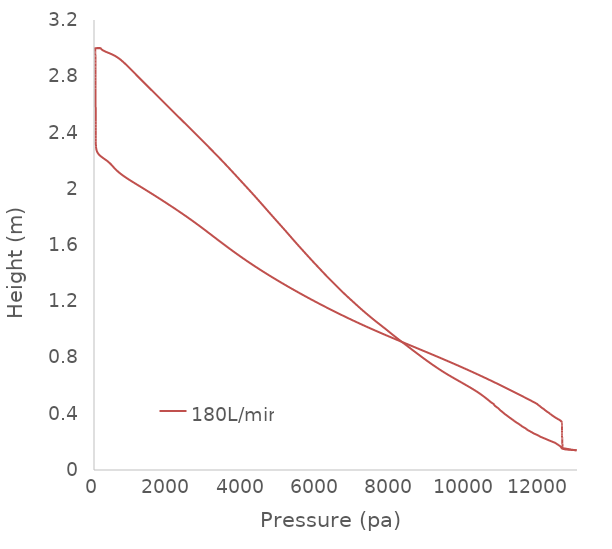
| Category | 180L/min |
|---|---|
| 12989.8 | 0.14 |
| 12873.3 | 0.144 |
| 12839.8 | 0.145 |
| 12805.4 | 0.146 |
| 12789.6 | 0.148 |
| 12781.4 | 0.148 |
| 12733.1 | 0.15 |
| 12626.4 | 0.155 |
| 12600.3 | 0.16 |
| 12592.9 | 0.161 |
| 12579.8 | 0.163 |
| 12565.2 | 0.165 |
| 12561.5 | 0.165 |
| 12538.0 | 0.171 |
| 12532.4 | 0.172 |
| 12508.9 | 0.176 |
| 12489.8 | 0.179 |
| 12482.9 | 0.181 |
| 12481.7 | 0.181 |
| 12480.0 | 0.181 |
| 12477.1 | 0.182 |
| 12473.1 | 0.182 |
| 12468.8 | 0.183 |
| 12459.2 | 0.185 |
| 12419.6 | 0.192 |
| 12405.7 | 0.194 |
| 12341.0 | 0.2 |
| 12339.1 | 0.201 |
| 12335.1 | 0.201 |
| 12332.5 | 0.201 |
| 12329.9 | 0.202 |
| 12326.6 | 0.202 |
| 12228.7 | 0.213 |
| 12225.3 | 0.213 |
| 12221.2 | 0.214 |
| 12216.1 | 0.214 |
| 12212.2 | 0.215 |
| 12127.2 | 0.224 |
| 12122.5 | 0.225 |
| 12119.1 | 0.225 |
| 12113.7 | 0.226 |
| 12104.6 | 0.227 |
| 12081.7 | 0.229 |
| 12074.8 | 0.23 |
| 12013.3 | 0.237 |
| 12000.2 | 0.239 |
| 11978.7 | 0.242 |
| 11927.0 | 0.249 |
| 11925.8 | 0.25 |
| 11921.2 | 0.25 |
| 11912.1 | 0.251 |
| 11911.8 | 0.251 |
| 11904.4 | 0.252 |
| 11903.8 | 0.252 |
| 11903.5 | 0.252 |
| 11845.5 | 0.259 |
| 11843.0 | 0.259 |
| 11804.2 | 0.265 |
| 11801.4 | 0.265 |
| 11798.2 | 0.266 |
| 11796.9 | 0.266 |
| 11750.8 | 0.273 |
| 11740.7 | 0.274 |
| 11740.6 | 0.274 |
| 11739.9 | 0.275 |
| 11735.3 | 0.275 |
| 11734.8 | 0.275 |
| 11709.9 | 0.279 |
| 11674.6 | 0.284 |
| 11669.1 | 0.285 |
| 11664.1 | 0.286 |
| 11660.1 | 0.286 |
| 11627.2 | 0.293 |
| 11614.3 | 0.296 |
| 11614.2 | 0.296 |
| 11613.7 | 0.296 |
| 11611.8 | 0.297 |
| 11606.0 | 0.298 |
| 11602.3 | 0.298 |
| 11574.0 | 0.302 |
| 11542.9 | 0.307 |
| 11537.3 | 0.308 |
| 11533.9 | 0.308 |
| 11532.3 | 0.308 |
| 11528.4 | 0.309 |
| 11518.9 | 0.311 |
| 11518.0 | 0.311 |
| 11512.5 | 0.312 |
| 11468.9 | 0.321 |
| 11463.5 | 0.322 |
| 11460.0 | 0.323 |
| 11423.0 | 0.329 |
| 11417.9 | 0.33 |
| 11410.7 | 0.331 |
| 11404.7 | 0.332 |
| 11402.2 | 0.333 |
| 11398.3 | 0.333 |
| 11397.1 | 0.333 |
| 11350.8 | 0.341 |
| 11347.8 | 0.342 |
| 11339.6 | 0.343 |
| 11331.8 | 0.345 |
| 11314.1 | 0.348 |
| 11314.0 | 0.348 |
| 11313.9 | 0.348 |
| 11313.6 | 0.348 |
| 11306.8 | 0.35 |
| 11300.0 | 0.351 |
| 11281.8 | 0.355 |
| 11280.9 | 0.355 |
| 11261.1 | 0.359 |
| 11253.6 | 0.36 |
| 11252.7 | 0.36 |
| 11249.8 | 0.361 |
| 11244.6 | 0.362 |
| 11239.3 | 0.363 |
| 11200.4 | 0.37 |
| 11196.5 | 0.371 |
| 11191.0 | 0.372 |
| 11179.5 | 0.374 |
| 11156.5 | 0.379 |
| 11152.1 | 0.38 |
| 11144.9 | 0.381 |
| 11110.9 | 0.388 |
| 11110.4 | 0.388 |
| 11105.3 | 0.389 |
| 11103.4 | 0.389 |
| 11101.3 | 0.39 |
| 11091.6 | 0.392 |
| 11079.9 | 0.394 |
| 11053.1 | 0.398 |
| 11044.4 | 0.401 |
| 11043.6 | 0.401 |
| 11042.9 | 0.401 |
| 10999.7 | 0.411 |
| 10997.2 | 0.412 |
| 10996.3 | 0.412 |
| 10992.0 | 0.413 |
| 10991.6 | 0.413 |
| 10990.8 | 0.413 |
| 10966.4 | 0.418 |
| 10939.7 | 0.423 |
| 10938.6 | 0.424 |
| 10935.9 | 0.424 |
| 10934.4 | 0.425 |
| 10904.1 | 0.433 |
| 10890.9 | 0.436 |
| 10889.8 | 0.437 |
| 10886.7 | 0.437 |
| 10861.3 | 0.442 |
| 10837.0 | 0.447 |
| 10836.5 | 0.447 |
| 10836.3 | 0.447 |
| 10834.8 | 0.448 |
| 10833.1 | 0.448 |
| 10831.9 | 0.448 |
| 10828.3 | 0.449 |
| 10823.1 | 0.45 |
| 10793.2 | 0.456 |
| 10791.4 | 0.457 |
| 10789.7 | 0.457 |
| 10778.8 | 0.46 |
| 10764.4 | 0.465 |
| 10764.1 | 0.465 |
| 10753.7 | 0.47 |
| 10753.6 | 0.47 |
| 10753.4 | 0.47 |
| 10753.4 | 0.47 |
| 10692.8 | 0.48 |
| 10643.9 | 0.491 |
| 10595.8 | 0.501 |
| 10546.8 | 0.511 |
| 10495.9 | 0.522 |
| 10443.0 | 0.532 |
| 10387.8 | 0.542 |
| 10330.2 | 0.553 |
| 10270.0 | 0.563 |
| 10207.1 | 0.574 |
| 10141.9 | 0.584 |
| 10075.1 | 0.594 |
| 10007.4 | 0.605 |
| 9939.27 | 0.615 |
| 9870.69 | 0.625 |
| 9801.86 | 0.636 |
| 9733.11 | 0.646 |
| 9664.73 | 0.656 |
| 9597.02 | 0.667 |
| 9530.4 | 0.677 |
| 9465.31 | 0.687 |
| 9402.01 | 0.698 |
| 9340.6 | 0.708 |
| 9280.8 | 0.718 |
| 9222.14 | 0.729 |
| 9164.33 | 0.739 |
| 9107.37 | 0.75 |
| 9051.39 | 0.76 |
| 8996.33 | 0.77 |
| 8942.04 | 0.781 |
| 8888.41 | 0.791 |
| 8835.31 | 0.801 |
| 8782.59 | 0.812 |
| 8730.14 | 0.822 |
| 8677.87 | 0.832 |
| 8625.86 | 0.843 |
| 8574.26 | 0.853 |
| 8523.09 | 0.863 |
| 8472.11 | 0.874 |
| 8420.96 | 0.884 |
| 8369.46 | 0.894 |
| 8317.7 | 0.905 |
| 8266.07 | 0.915 |
| 8215.01 | 0.926 |
| 8164.58 | 0.936 |
| 8114.61 | 0.946 |
| 8064.98 | 0.957 |
| 8015.71 | 0.967 |
| 7966.97 | 0.977 |
| 7918.63 | 0.988 |
| 7870.11 | 0.998 |
| 7820.95 | 1.008 |
| 7771.13 | 1.019 |
| 7720.89 | 1.029 |
| 7670.5 | 1.039 |
| 7620.41 | 1.05 |
| 7571.04 | 1.06 |
| 7522.5 | 1.07 |
| 7474.63 | 1.081 |
| 7427.23 | 1.091 |
| 7380.23 | 1.102 |
| 7333.67 | 1.112 |
| 7287.59 | 1.122 |
| 7242.06 | 1.133 |
| 7197.15 | 1.143 |
| 7152.88 | 1.153 |
| 7109.18 | 1.164 |
| 7065.91 | 1.174 |
| 7022.84 | 1.184 |
| 6979.84 | 1.195 |
| 6936.85 | 1.205 |
| 6893.82 | 1.215 |
| 6850.87 | 1.226 |
| 6808.23 | 1.236 |
| 6766.22 | 1.246 |
| 6725.02 | 1.257 |
| 6684.53 | 1.267 |
| 6644.54 | 1.278 |
| 6604.82 | 1.288 |
| 6565.28 | 1.298 |
| 6525.86 | 1.309 |
| 6486.56 | 1.319 |
| 6447.39 | 1.329 |
| 6408.34 | 1.34 |
| 6369.46 | 1.35 |
| 6330.8 | 1.36 |
| 6292.37 | 1.371 |
| 6254.16 | 1.381 |
| 6216.36 | 1.391 |
| 6179.1 | 1.402 |
| 6142.33 | 1.412 |
| 6105.77 | 1.422 |
| 6069.14 | 1.433 |
| 6032.34 | 1.443 |
| 5995.43 | 1.454 |
| 5958.49 | 1.464 |
| 5921.67 | 1.474 |
| 5885.08 | 1.485 |
| 5848.79 | 1.495 |
| 5812.77 | 1.505 |
| 5776.95 | 1.516 |
| 5741.29 | 1.526 |
| 5705.78 | 1.536 |
| 5670.39 | 1.547 |
| 5635.01 | 1.557 |
| 5599.6 | 1.567 |
| 5564.15 | 1.578 |
| 5528.76 | 1.588 |
| 5493.56 | 1.598 |
| 5458.62 | 1.609 |
| 5423.97 | 1.619 |
| 5389.54 | 1.63 |
| 5355.25 | 1.64 |
| 5321.06 | 1.65 |
| 5286.96 | 1.661 |
| 5252.91 | 1.671 |
| 5218.88 | 1.681 |
| 5184.81 | 1.692 |
| 5150.57 | 1.702 |
| 5114.45 | 1.713 |
| 5075.93 | 1.724 |
| 5035.93 | 1.736 |
| 4996.51 | 1.748 |
| 4959.27 | 1.759 |
| 4924.35 | 1.769 |
| 4889.46 | 1.779 |
| 4854.59 | 1.79 |
| 4819.76 | 1.8 |
| 4784.97 | 1.81 |
| 4750.25 | 1.821 |
| 4715.65 | 1.831 |
| 4681.16 | 1.842 |
| 4646.75 | 1.852 |
| 4612.38 | 1.862 |
| 4577.99 | 1.873 |
| 4543.55 | 1.883 |
| 4509.04 | 1.893 |
| 4474.48 | 1.904 |
| 4439.83 | 1.914 |
| 4405.06 | 1.924 |
| 4370.16 | 1.935 |
| 4335.13 | 1.945 |
| 4299.93 | 1.955 |
| 4264.56 | 1.966 |
| 4229.03 | 1.976 |
| 4193.31 | 1.986 |
| 4157.43 | 1.997 |
| 4121.43 | 2.007 |
| 4085.36 | 2.018 |
| 4049.25 | 2.028 |
| 4013.16 | 2.038 |
| 3977.11 | 2.049 |
| 3941.1 | 2.059 |
| 3905.13 | 2.069 |
| 3869.18 | 2.08 |
| 3833.19 | 2.09 |
| 3797.15 | 2.1 |
| 3761.01 | 2.111 |
| 3724.76 | 2.121 |
| 3688.38 | 2.131 |
| 3651.86 | 2.142 |
| 3615.18 | 2.152 |
| 3578.34 | 2.162 |
| 3541.35 | 2.173 |
| 3504.21 | 2.183 |
| 3466.92 | 2.194 |
| 3429.46 | 2.204 |
| 3391.83 | 2.214 |
| 3354.02 | 2.225 |
| 3316.01 | 2.235 |
| 3277.83 | 2.245 |
| 3239.56 | 2.256 |
| 3201.21 | 2.266 |
| 3162.78 | 2.276 |
| 3124.27 | 2.287 |
| 3085.67 | 2.297 |
| 3046.96 | 2.307 |
| 3008.15 | 2.318 |
| 2969.26 | 2.328 |
| 2930.29 | 2.338 |
| 2891.27 | 2.349 |
| 2852.19 | 2.359 |
| 2813.09 | 2.37 |
| 2773.96 | 2.38 |
| 2734.8 | 2.39 |
| 2695.62 | 2.401 |
| 2656.38 | 2.411 |
| 2617.06 | 2.421 |
| 2577.66 | 2.432 |
| 2538.16 | 2.442 |
| 2498.55 | 2.452 |
| 2458.87 | 2.463 |
| 2419.15 | 2.473 |
| 2379.42 | 2.483 |
| 2339.69 | 2.494 |
| 2299.95 | 2.504 |
| 2260.21 | 2.514 |
| 2220.45 | 2.525 |
| 2180.66 | 2.535 |
| 2140.87 | 2.546 |
| 2101.12 | 2.556 |
| 2061.45 | 2.566 |
| 2021.89 | 2.577 |
| 1982.42 | 2.587 |
| 1943.05 | 2.597 |
| 1903.76 | 2.608 |
| 1864.56 | 2.618 |
| 1825.41 | 2.628 |
| 1786.31 | 2.639 |
| 1747.2 | 2.649 |
| 1708.05 | 2.659 |
| 1668.82 | 2.67 |
| 1629.5 | 2.68 |
| 1590.06 | 2.69 |
| 1550.52 | 2.701 |
| 1510.9 | 2.711 |
| 1471.26 | 2.722 |
| 1431.66 | 2.732 |
| 1392.17 | 2.742 |
| 1352.82 | 2.753 |
| 1313.62 | 2.763 |
| 1274.56 | 2.773 |
| 1235.65 | 2.784 |
| 1196.88 | 2.794 |
| 1158.24 | 2.804 |
| 1119.72 | 2.815 |
| 1081.3 | 2.825 |
| 1042.88 | 2.835 |
| 1004.36 | 2.846 |
| 965.562 | 2.856 |
| 926.287 | 2.866 |
| 886.264 | 2.877 |
| 845.184 | 2.887 |
| 802.846 | 2.898 |
| 758.913 | 2.908 |
| 712.304 | 2.918 |
| 661.055 | 2.929 |
| 602.511 | 2.939 |
| 533.222 | 2.949 |
| 449.851 | 2.96 |
| 354.052 | 2.97 |
| 354.052 | 2.97 |
| 269.466 | 2.98 |
| 209.001 | 2.99 |
| 167.58 | 3 |
| 64.7658 | 3 |
| 65.4261 | 3 |
| 69.8875 | 3 |
| 74.6474 | 3 |
| 80.4253 | 3 |
| 90.9107 | 3 |
| 93.7658 | 3 |
| 104.351 | 3 |
| 119.027 | 3 |
| 147.626 | 3 |
| 167.402 | 3 |
| 167.576 | 3 |
| 41.6224 | 3 |
| 40.6998 | 3 |
| 40.5293 | 3 |
| 40.5456 | 3 |
| 40.5948 | 3 |
| 36.4905 | 3 |
| 36.4893 | 3 |
| 36.4923 | 3 |
| 36.4924 | 3 |
| 36.507 | 3 |
| 36.5182 | 3 |
| 36.5183 | 3 |
| 36.5185 | 2.997 |
| 36.5088 | 2.988 |
| 36.4907 | 2.978 |
| 36.5121 | 2.969 |
| 36.7163 | 2.959 |
| 37.2044 | 2.95 |
| 37.7325 | 2.94 |
| 38.0462 | 2.93 |
| 38.2506 | 2.92 |
| 38.3999 | 2.91 |
| 38.5171 | 2.9 |
| 38.6111 | 2.89 |
| 38.6933 | 2.88 |
| 38.773 | 2.87 |
| 38.8561 | 2.86 |
| 38.9531 | 2.85 |
| 39.1612 | 2.83 |
| 39.3802 | 2.811 |
| 39.6335 | 2.791 |
| 39.9232 | 2.771 |
| 40.2509 | 2.752 |
| 40.6139 | 2.732 |
| 41.003 | 2.712 |
| 41.4098 | 2.692 |
| 41.8278 | 2.673 |
| 42.252 | 2.653 |
| 42.6772 | 2.633 |
| 43.1 | 2.614 |
| 43.5188 | 2.594 |
| 43.9328 | 2.574 |
| 44.3414 | 2.555 |
| 44.7441 | 2.535 |
| 45.1387 | 2.515 |
| 45.5198 | 2.495 |
| 45.8794 | 2.476 |
| 46.2085 | 2.456 |
| 46.4997 | 2.436 |
| 46.7454 | 2.417 |
| 46.9434 | 2.397 |
| 47.1183 | 2.377 |
| 47.3575 | 2.358 |
| 47.9154 | 2.338 |
| 49.4848 | 2.318 |
| 53.8287 | 2.298 |
| 64.9764 | 2.279 |
| 91.1984 | 2.259 |
| 145.888 | 2.239 |
| 238.563 | 2.22 |
| 344.393 | 2.2 |
| 432.537 | 2.18 |
| 502.614 | 2.16 |
| 572.153 | 2.14 |
| 652.385 | 2.12 |
| 746.136 | 2.101 |
| 852.063 | 2.081 |
| 967.226 | 2.061 |
| 1087.96 | 2.041 |
| 1210.8 | 2.021 |
| 1333.52 | 2.001 |
| 1455.21 | 1.981 |
| 1575.61 | 1.961 |
| 1694.59 | 1.941 |
| 1812.12 | 1.922 |
| 1928.3 | 1.902 |
| 2043.26 | 1.882 |
| 2156.97 | 1.862 |
| 2269.25 | 1.842 |
| 2379.85 | 1.822 |
| 2488.57 | 1.802 |
| 2595.28 | 1.782 |
| 2699.99 | 1.763 |
| 2802.81 | 1.743 |
| 2903.99 | 1.723 |
| 3003.87 | 1.703 |
| 3102.86 | 1.683 |
| 3201.41 | 1.663 |
| 3299.97 | 1.643 |
| 3398.96 | 1.623 |
| 3498.76 | 1.603 |
| 3599.66 | 1.584 |
| 3701.93 | 1.564 |
| 3805.82 | 1.544 |
| 3911.52 | 1.524 |
| 4019.19 | 1.504 |
| 4128.94 | 1.484 |
| 4240.87 | 1.464 |
| 4355.03 | 1.444 |
| 4471.4 | 1.424 |
| 4589.96 | 1.405 |
| 4710.77 | 1.385 |
| 4710.77 | 1.385 |
| 4833.93 | 1.365 |
| 4959.34 | 1.345 |
| 5086.89 | 1.325 |
| 5216.52 | 1.305 |
| 5348.22 | 1.285 |
| 5482.01 | 1.265 |
| 5617.91 | 1.246 |
| 5755.94 | 1.226 |
| 5896.16 | 1.206 |
| 6038.6 | 1.186 |
| 6183.33 | 1.166 |
| 6330.43 | 1.146 |
| 6480.02 | 1.126 |
| 6632.27 | 1.106 |
| 6787.32 | 1.086 |
| 6945.33 | 1.067 |
| 7106.45 | 1.047 |
| 7270.82 | 1.027 |
| 7438.47 | 1.007 |
| 7609.32 | 0.987 |
| 7783.18 | 0.967 |
| 7959.71 | 0.947 |
| 8138.41 | 0.927 |
| 8318.71 | 0.907 |
| 8499.95 | 0.888 |
| 8681.53 | 0.868 |
| 8862.84 | 0.848 |
| 9043.3 | 0.828 |
| 9222.47 | 0.808 |
| 9399.9 | 0.788 |
| 9575.34 | 0.768 |
| 9748.54 | 0.748 |
| 9919.32 | 0.729 |
| 10087.6 | 0.709 |
| 10253.2 | 0.689 |
| 10416.3 | 0.669 |
| 10576.9 | 0.649 |
| 10734.9 | 0.629 |
| 10890.6 | 0.609 |
| 11044.0 | 0.589 |
| 11195.1 | 0.569 |
| 11344.2 | 0.55 |
| 11492.1 | 0.53 |
| 11639.6 | 0.51 |
| 11784.4 | 0.49 |
| 11925.9 | 0.47 |
| 11925.9 | 0.47 |
| 11926.1 | 0.47 |
| 11928.3 | 0.469 |
| 11928.8 | 0.469 |
| 11929.5 | 0.469 |
| 11930.1 | 0.468 |
| 11934.5 | 0.467 |
| 11935.0 | 0.467 |
| 11935.1 | 0.467 |
| 11935.4 | 0.467 |
| 11943.6 | 0.466 |
| 11943.6 | 0.466 |
| 11944.8 | 0.465 |
| 11946.0 | 0.465 |
| 11950.7 | 0.464 |
| 11960.7 | 0.462 |
| 11964.0 | 0.461 |
| 11966.8 | 0.46 |
| 11967.1 | 0.46 |
| 11976.5 | 0.459 |
| 11978.6 | 0.459 |
| 11985.1 | 0.457 |
| 11986.2 | 0.457 |
| 11986.5 | 0.457 |
| 11987.8 | 0.457 |
| 11997.4 | 0.455 |
| 12012.7 | 0.451 |
| 12023.0 | 0.449 |
| 12024.2 | 0.448 |
| 12027.3 | 0.448 |
| 12041.8 | 0.445 |
| 12051.5 | 0.443 |
| 12055.8 | 0.442 |
| 12057.9 | 0.442 |
| 12063.7 | 0.441 |
| 12066.8 | 0.44 |
| 12069.7 | 0.44 |
| 12095.8 | 0.435 |
| 12098.1 | 0.435 |
| 12119.6 | 0.43 |
| 12122.3 | 0.429 |
| 12122.8 | 0.429 |
| 12123.7 | 0.429 |
| 12129.1 | 0.428 |
| 12131.6 | 0.427 |
| 12134.5 | 0.427 |
| 12139.4 | 0.426 |
| 12151.6 | 0.423 |
| 12184.5 | 0.417 |
| 12190.9 | 0.416 |
| 12194.5 | 0.415 |
| 12199.7 | 0.414 |
| 12205.2 | 0.413 |
| 12223.6 | 0.41 |
| 12226.8 | 0.409 |
| 12242.6 | 0.406 |
| 12246.3 | 0.406 |
| 12250.0 | 0.405 |
| 12251.3 | 0.405 |
| 12251.4 | 0.405 |
| 12252.8 | 0.405 |
| 12253.0 | 0.405 |
| 12254.8 | 0.404 |
| 12268.7 | 0.401 |
| 12294.2 | 0.396 |
| 12298.3 | 0.395 |
| 12301.2 | 0.395 |
| 12302.9 | 0.394 |
| 12347.2 | 0.385 |
| 12350.4 | 0.385 |
| 12353.8 | 0.384 |
| 12367.7 | 0.382 |
| 12377.5 | 0.38 |
| 12393.9 | 0.377 |
| 12412.4 | 0.374 |
| 12418.1 | 0.373 |
| 12429.4 | 0.371 |
| 12442.3 | 0.369 |
| 12461.2 | 0.366 |
| 12467.2 | 0.365 |
| 12476.0 | 0.364 |
| 12482.9 | 0.363 |
| 12512.1 | 0.358 |
| 12519.5 | 0.357 |
| 12537.0 | 0.355 |
| 12548.6 | 0.353 |
| 12555.6 | 0.351 |
| 12558.0 | 0.351 |
| 12566.7 | 0.348 |
| 12570.0 | 0.347 |
| 12575.6 | 0.346 |
| 12586.5 | 0.343 |
| 12588.0 | 0.342 |
| 12589.5 | 0.342 |
| 12590.9 | 0.341 |
| 12592.0 | 0.34 |
| 12592.0 | 0.34 |
| 12591.8 | 0.338 |
| 12592.6 | 0.337 |
| 12592.9 | 0.337 |
| 12594.2 | 0.335 |
| 12594.0 | 0.334 |
| 12594.0 | 0.334 |
| 12594.3 | 0.333 |
| 12595.1 | 0.329 |
| 12594.9 | 0.329 |
| 12593.7 | 0.327 |
| 12593.9 | 0.325 |
| 12593.9 | 0.325 |
| 12593.9 | 0.323 |
| 12593.4 | 0.322 |
| 12593.2 | 0.321 |
| 12592.9 | 0.32 |
| 12593.1 | 0.318 |
| 12593.4 | 0.316 |
| 12593.3 | 0.315 |
| 12593.2 | 0.315 |
| 12593.2 | 0.314 |
| 12593.3 | 0.313 |
| 12593.4 | 0.311 |
| 12593.4 | 0.309 |
| 12593.4 | 0.307 |
| 12593.5 | 0.305 |
| 12593.5 | 0.304 |
| 12593.5 | 0.302 |
| 12593.6 | 0.301 |
| 12593.6 | 0.301 |
| 12593.6 | 0.298 |
| 12593.6 | 0.297 |
| 12593.6 | 0.296 |
| 12593.7 | 0.294 |
| 12593.7 | 0.291 |
| 12593.7 | 0.291 |
| 12593.7 | 0.291 |
| 12593.8 | 0.29 |
| 12593.8 | 0.29 |
| 12593.9 | 0.287 |
| 12593.9 | 0.287 |
| 12593.9 | 0.286 |
| 12594.0 | 0.284 |
| 12594.1 | 0.282 |
| 12594.2 | 0.282 |
| 12594.3 | 0.28 |
| 12594.5 | 0.278 |
| 12594.5 | 0.278 |
| 12594.8 | 0.274 |
| 12594.8 | 0.274 |
| 12595.0 | 0.272 |
| 12595.0 | 0.271 |
| 12595.1 | 0.27 |
| 12595.3 | 0.268 |
| 12595.5 | 0.266 |
| 12595.9 | 0.262 |
| 12596.0 | 0.261 |
| 12596.0 | 0.261 |
| 12596.0 | 0.261 |
| 12596.1 | 0.26 |
| 12596.2 | 0.259 |
| 12596.3 | 0.258 |
| 12596.5 | 0.256 |
| 12596.8 | 0.254 |
| 12597.0 | 0.252 |
| 12597.1 | 0.251 |
| 12597.2 | 0.251 |
| 12597.6 | 0.247 |
| 12597.7 | 0.246 |
| 12597.8 | 0.245 |
| 12598.1 | 0.242 |
| 12598.4 | 0.24 |
| 12598.6 | 0.239 |
| 12598.9 | 0.237 |
| 12599.1 | 0.235 |
| 12599.3 | 0.234 |
| 12599.5 | 0.233 |
| 12599.5 | 0.233 |
| 12599.8 | 0.232 |
| 12600.3 | 0.228 |
| 12600.5 | 0.227 |
| 12600.8 | 0.226 |
| 12601.1 | 0.224 |
| 12601.3 | 0.223 |
| 12601.6 | 0.221 |
| 12601.7 | 0.22 |
| 12602.2 | 0.216 |
| 12602.3 | 0.216 |
| 12602.4 | 0.215 |
| 12602.4 | 0.214 |
| 12602.5 | 0.213 |
| 12602.8 | 0.211 |
| 12603.2 | 0.209 |
| 12603.2 | 0.208 |
| 12603.4 | 0.207 |
| 12603.6 | 0.206 |
| 12603.6 | 0.206 |
| 12604.3 | 0.202 |
| 12604.3 | 0.201 |
| 12604.7 | 0.198 |
| 12604.8 | 0.198 |
| 12605.1 | 0.195 |
| 12605.1 | 0.195 |
| 12605.8 | 0.19 |
| 12605.8 | 0.19 |
| 12605.9 | 0.189 |
| 12606.0 | 0.189 |
| 12606.0 | 0.189 |
| 12606.0 | 0.188 |
| 12606.1 | 0.188 |
| 12606.6 | 0.183 |
| 12606.8 | 0.181 |
| 12606.8 | 0.18 |
| 12607.1 | 0.178 |
| 12607.1 | 0.178 |
| 12607.2 | 0.177 |
| 12607.2 | 0.177 |
| 12607.3 | 0.174 |
| 12607.3 | 0.171 |
| 12607.3 | 0.171 |
| 12606.8 | 0.168 |
| 12606.8 | 0.168 |
| 12606.6 | 0.166 |
| 12606.6 | 0.165 |
| 12606.8 | 0.165 |
| 12606.2 | 0.165 |
| 12601.7 | 0.163 |
| 12579.0 | 0.159 |
| 12579.8 | 0.158 |
| 12580.3 | 0.158 |
| 12599.4 | 0.153 |
| 12601.8 | 0.152 |
| 12607.6 | 0.152 |
| 12610.8 | 0.151 |
| 12678.5 | 0.147 |
| 12720.2 | 0.145 |
| 12722.6 | 0.145 |
| 12838.9 | 0.143 |
| 12908.1 | 0.142 |
| 12989.8 | 0.14 |